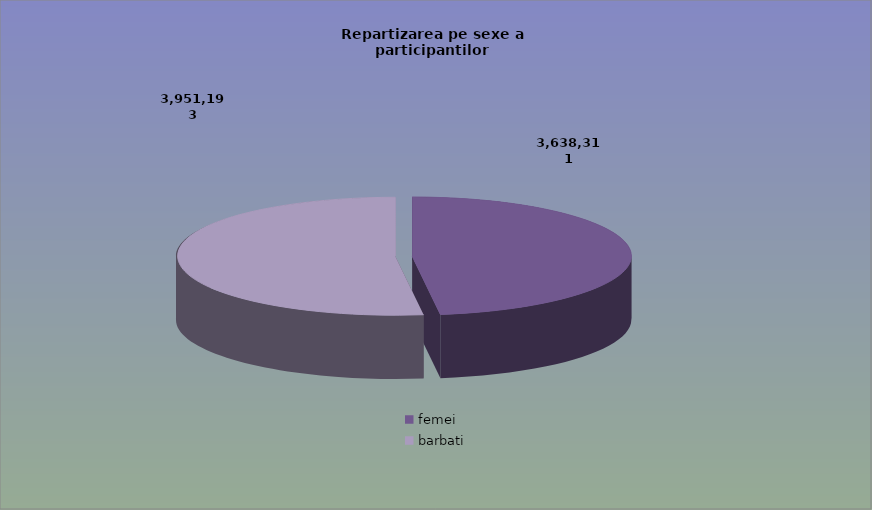
| Category | Series 0 |
|---|---|
| femei | 3638311 |
| barbati | 3951193 |